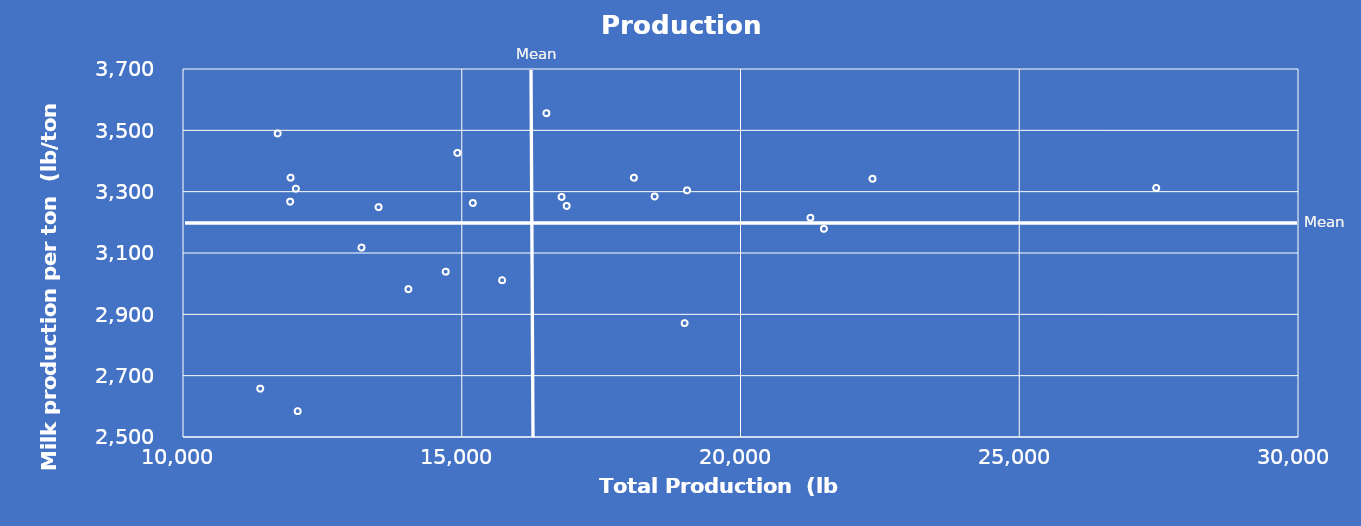
| Category | Series 0 |
|---|---|
| 16789.916870973 | 3282.873 |
| 14044.145900106 | 2982.123 |
| 12056.873179279 | 2584.373 |
| 11385.548149375 | 2657.623 |
| 16518.0 | 3555.873 |
| 18997.763989028 | 2871.373 |
| 15198.266498604 | 3263.123 |
| 14711.985143313 | 3039.123 |
| 11921.795235907 | 3267.373 |
| 14920.513510809 | 3426.373 |
| 21253.27769163 | 3214.812 |
| 21497.045898805 | 3178.873 |
| 18459.422652009 | 3284.312 |
| 12025.324509114 | 3309.812 |
| 11928.766376388 | 3345.623 |
| 13201.172531177 | 3117.623 |
| 11698.563489661 | 3489.873 |
| 22366.575137984 | 3342.123 |
| 15724.123083519 | 3011.373 |
| 13507.467226589 | 3249.562 |
| 16881.884244781 | 3253.373 |
| 27456.579209718 | 3312.373 |
| 19041.885919472 | 3304.373 |
| 18087.186256929 | 3345.562 |